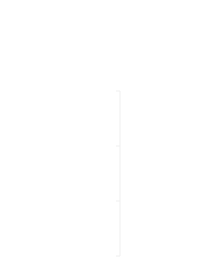
| Category | Pozitivno | Negativno |
|---|---|---|
| 0 | 0 | 0 |
| 1 | 0 | 0 |
| 2 | 0 | 0 |